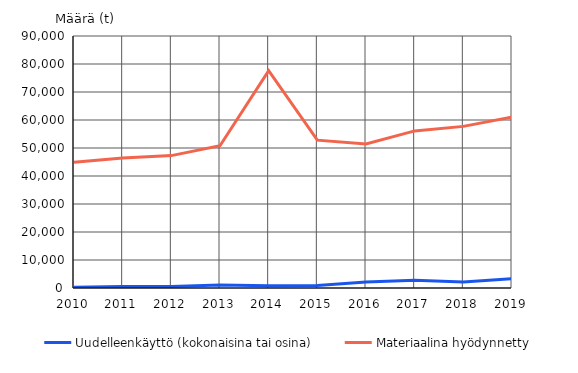
| Category | Uudelleenkäyttö (kokonaisina tai osina) | Materiaalina hyödynnetty |
|---|---|---|
| 2010.0 | 288 | 44899 |
| 2011.0 | 535 | 46409 |
| 2012.0 | 564 | 47286 |
| 2013.0 | 1089 | 50805 |
| 2014.0 | 833 | 77640 |
| 2015.0 | 913 | 52794 |
| 2016.0 | 2116 | 51437 |
| 2017.0 | 2749 | 56108 |
| 2018.0 | 2102 | 57720 |
| 2019.0 | 3322 | 61016 |